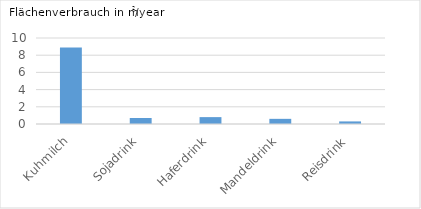
| Category | Flächenverbrauch in m2/year |
|---|---|
| Kuhmilch | 8.9 |
| Sojadrink | 0.7 |
| Haferdrink | 0.8 |
| Mandeldrink | 0.6 |
| Reisdrink | 0.3 |